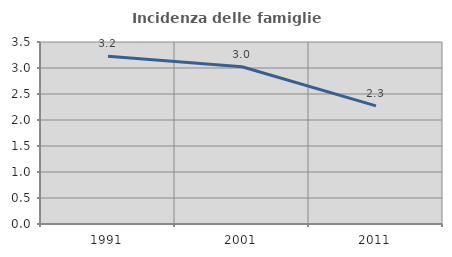
| Category | Incidenza delle famiglie numerose |
|---|---|
| 1991.0 | 3.228 |
| 2001.0 | 3.024 |
| 2011.0 | 2.273 |